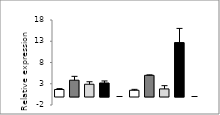
| Category | Series 0 |
|---|---|
|  - | 1.649 |
| HC | 3.834 |